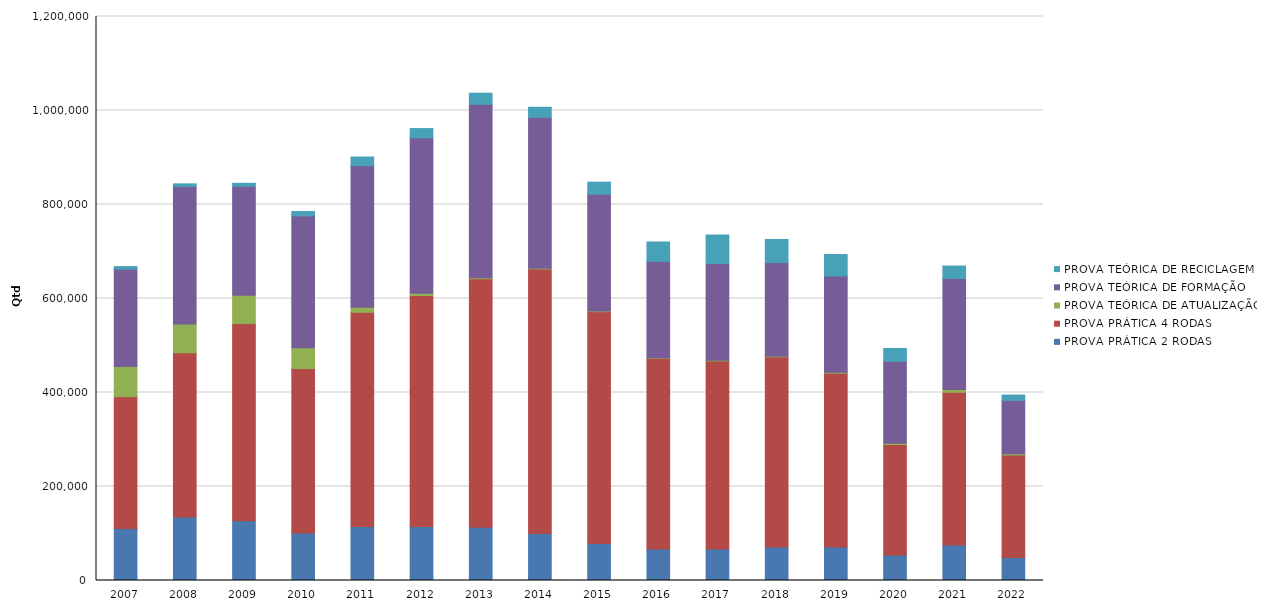
| Category | PROVA PRÁTICA 2 RODAS | PROVA PRÁTICA 4 RODAS | PROVA TEÓRICA DE ATUALIZAÇÃO | PROVA TEÓRICA DE FORMAÇÃO | PROVA TEÓRICA DE RECICLAGEM |
|---|---|---|---|---|---|
| 2007 | 110674 | 280430 | 64217 | 207117 | 5429 |
| 2008 | 134944 | 349585 | 61004 | 292986 | 5414 |
| 2009 | 127067 | 419635 | 60424 | 231502 | 6452 |
| 2010 | 101281 | 349759 | 43995 | 280652 | 9335 |
| 2011 | 114800 | 455808 | 10895 | 301305 | 18253 |
| 2012 | 114793 | 491478 | 4791 | 330765 | 19723 |
| 2013 | 113389 | 528681 | 2327 | 368704 | 23668 |
| 2014 | 99969 | 562815 | 1839 | 320792 | 21417 |
| 2015 | 78574 | 493400 | 1409 | 248298 | 25888 |
| 2016 | 66824 | 405964 | 1149 | 205155 | 41152 |
| 2017 | 67110 | 399950 | 1322 | 206100 | 60592 |
| 2018 | 71205 | 404461 | 1576 | 199182 | 49061 |
| 2019 | 71266 | 369755 | 1915 | 204932 | 45768 |
| 2020 | 54041 | 235241 | 2580 | 174429 | 27415 |
| 2021 | 75274 | 325197 | 6030 | 236157 | 26410 |
| 2022 | 48707 | 218289 | 2764 | 113374 | 11398 |